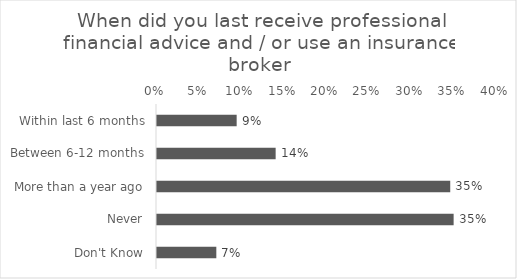
| Category | % of Respondents |
|---|---|
| Within last 6 months | 0.094 |
| Between 6-12 months | 0.14 |
| More than a year ago | 0.346 |
| Never | 0.35 |
| Don't Know | 0.07 |